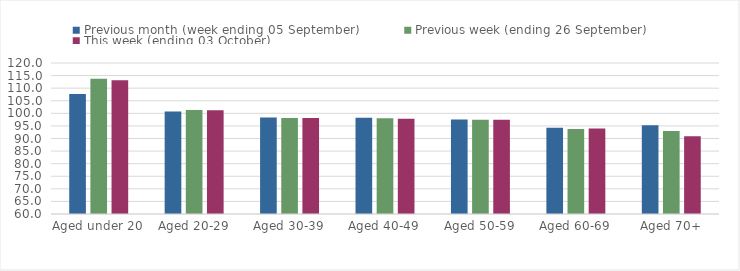
| Category | Previous month (week ending 05 September) | Previous week (ending 26 September) | This week (ending 03 October) |
|---|---|---|---|
| Aged under 20 | 107.72 | 113.79 | 113.17 |
| Aged 20-29 | 100.77 | 101.34 | 101.25 |
| Aged 30-39 | 98.3 | 98.18 | 98.1 |
| Aged 40-49 | 98.22 | 98.08 | 97.89 |
| Aged 50-59 | 97.58 | 97.45 | 97.44 |
| Aged 60-69 | 94.26 | 93.73 | 93.96 |
| Aged 70+ | 95.3 | 92.97 | 90.87 |